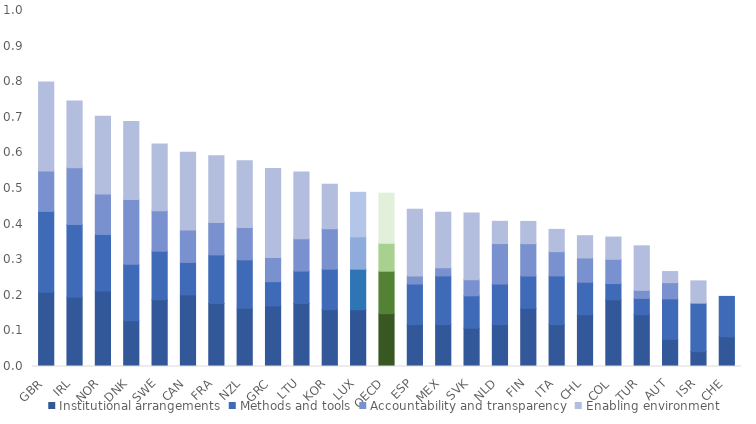
| Category | Institutional arrangements | Methods and tools | Accountability and transparency | Enabling environment |
|---|---|---|---|---|
| GBR | 0.208 | 0.227 | 0.114 | 0.25 |
| IRL | 0.194 | 0.205 | 0.159 | 0.188 |
| NOR | 0.212 | 0.159 | 0.114 | 0.219 |
| DNK | 0.128 | 0.159 | 0.182 | 0.219 |
| SWE | 0.188 | 0.136 | 0.114 | 0.188 |
| CAN | 0.201 | 0.091 | 0.091 | 0.219 |
| FRA | 0.177 | 0.136 | 0.091 | 0.188 |
| NZL | 0.163 | 0.136 | 0.091 | 0.188 |
| GRC | 0.17 | 0.068 | 0.068 | 0.25 |
| LTU | 0.177 | 0.091 | 0.091 | 0.188 |
| KOR | 0.16 | 0.114 | 0.114 | 0.125 |
| LUX | 0.16 | 0.114 | 0.091 | 0.125 |
| OECD | 0.148 | 0.119 | 0.079 | 0.141 |
| ESP | 0.118 | 0.114 | 0.023 | 0.188 |
| MEX | 0.118 | 0.136 | 0.023 | 0.156 |
| SVK | 0.108 | 0.091 | 0.045 | 0.188 |
| NLD | 0.118 | 0.114 | 0.114 | 0.062 |
| FIN | 0.163 | 0.091 | 0.091 | 0.062 |
| ITA | 0.118 | 0.136 | 0.068 | 0.062 |
| CHL | 0.146 | 0.091 | 0.068 | 0.062 |
| COL | 0.188 | 0.045 | 0.068 | 0.062 |
| TUR | 0.146 | 0.045 | 0.023 | 0.125 |
| AUT | 0.076 | 0.114 | 0.045 | 0.031 |
| ISR | 0.042 | 0.136 | 0 | 0.062 |
| CHE | 0.083 | 0.114 | 0 | 0 |